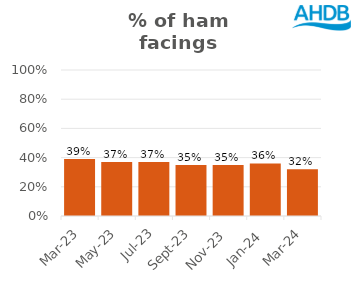
| Category | Ham |
|---|---|
| 2023-03-01 | 0.39 |
| 2023-05-01 | 0.37 |
| 2023-07-01 | 0.37 |
| 2023-09-01 | 0.35 |
| 2023-11-01 | 0.35 |
| 2024-01-01 | 0.36 |
| 2024-03-01 | 0.32 |